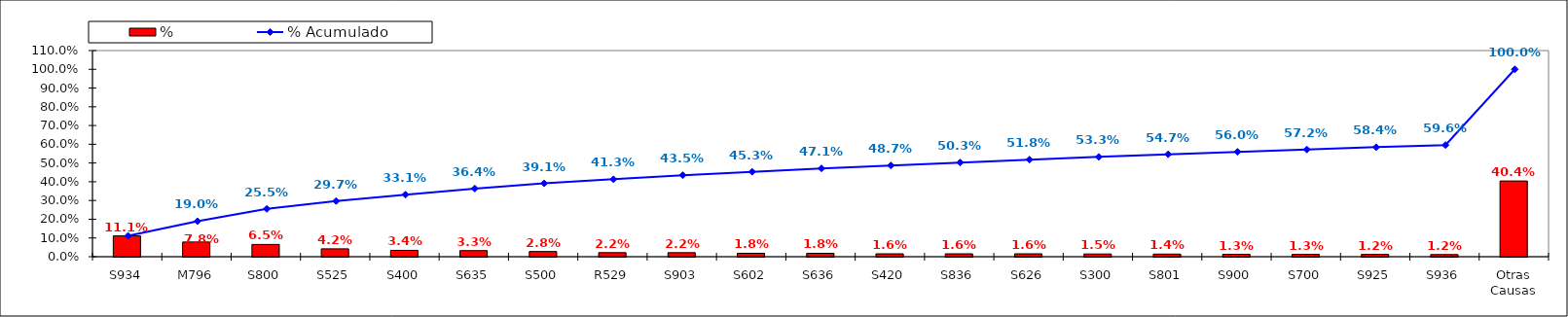
| Category | % |
|---|---|
| S934 | 0.111 |
| M796 | 0.078 |
| S800 | 0.065 |
| S525 | 0.042 |
| S400 | 0.034 |
| S635 | 0.033 |
| S500 | 0.028 |
| R529 | 0.022 |
| S903 | 0.022 |
| S602 | 0.018 |
| S636 | 0.018 |
| S420 | 0.016 |
| S836 | 0.016 |
| S626 | 0.016 |
| S300 | 0.015 |
| S801 | 0.014 |
| S900 | 0.013 |
| S700 | 0.013 |
| S925 | 0.012 |
| S936 | 0.012 |
| Otras Causas | 0.404 |